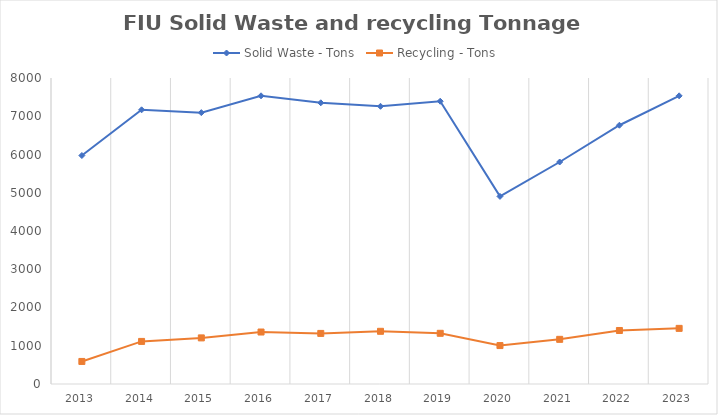
| Category | Solid Waste - Tons | Recycling - Tons  |
|---|---|---|
| 2013.0 | 5973.07 | 589.785 |
| 2014.0 | 7168.125 | 1113.24 |
| 2015.0 | 7094.657 | 1205.451 |
| 2016.0 | 7534.494 | 1358.97 |
| 2017.0 | 7351.95 | 1322.52 |
| 2018.0 | 7260.326 | 1377.785 |
| 2019.0 | 7392.188 | 1325.394 |
| 2020.0 | 4904.518 | 1004.575 |
| 2021.0 | 5803.587 | 1167.771 |
| 2022.0 | 6764.715 | 1398.699 |
| 2023.0 | 7533.64 | 1454.56 |